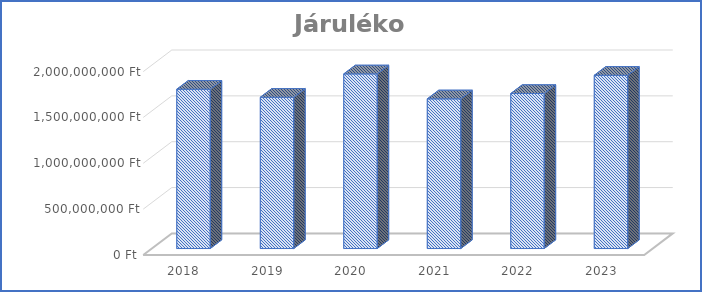
| Category | Járulékok |
|---|---|
| 2018.0 | 1737290781 |
| 2019.0 | 1649561332 |
| 2020.0 | 1904446184 |
| 2021.0 | 1632139718 |
| 2022.0 | 1690644768 |
| 2023.0 | 1889212622 |